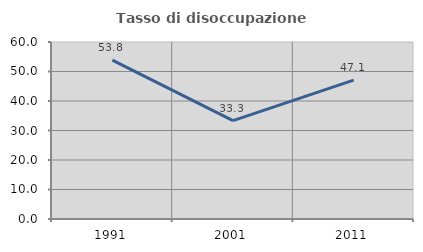
| Category | Tasso di disoccupazione giovanile  |
|---|---|
| 1991.0 | 53.846 |
| 2001.0 | 33.333 |
| 2011.0 | 47.059 |